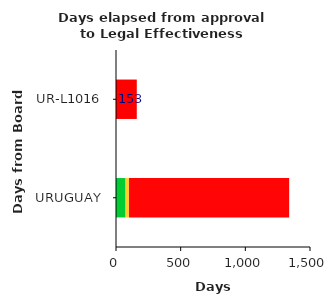
| Category | ALERT_LVL | PROBLEM_LVL | Remaining To Max |
|---|---|---|---|
| URUGUAY | 74 | 26.5 | 1238.5 |
| UR-L1016 | 0 | 0 | 0 |